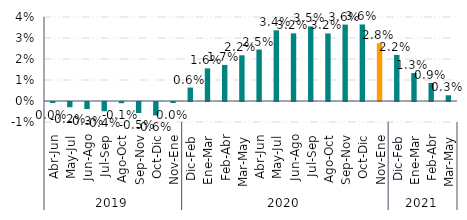
| Category | Total País |
|---|---|
| 0 | 0 |
| 1 | -0.002 |
| 2 | -0.003 |
| 3 | -0.004 |
| 4 | -0.001 |
| 5 | -0.005 |
| 6 | -0.006 |
| 7 | 0 |
| 8 | 0.006 |
| 9 | 0.016 |
| 10 | 0.017 |
| 11 | 0.022 |
| 12 | 0.025 |
| 13 | 0.034 |
| 14 | 0.032 |
| 15 | 0.035 |
| 16 | 0.032 |
| 17 | 0.036 |
| 18 | 0.036 |
| 19 | 0.028 |
| 20 | 0.022 |
| 21 | 0.013 |
| 22 | 0.009 |
| 23 | 0.003 |